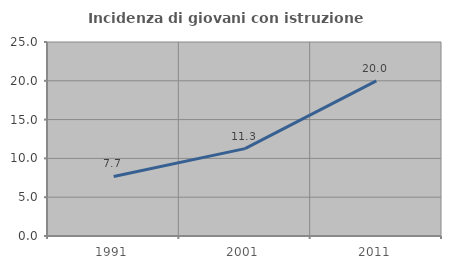
| Category | Incidenza di giovani con istruzione universitaria |
|---|---|
| 1991.0 | 7.676 |
| 2001.0 | 11.258 |
| 2011.0 | 20 |